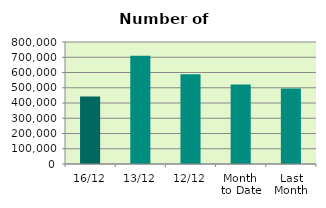
| Category | Series 0 |
|---|---|
| 16/12 | 442354 |
| 13/12 | 710586 |
| 12/12 | 589124 |
| Month 
to Date | 521539.455 |
| Last
Month | 495852.095 |